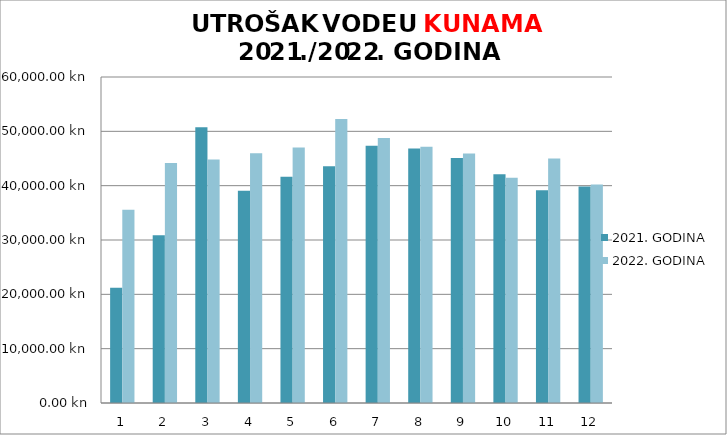
| Category | 2021. GODINA | 2022. GODINA |
|---|---|---|
| 0 | 21202 | 35562.43 |
| 1 | 30879.58 | 44162.57 |
| 2 | 50768.82 | 44831.15 |
| 3 | 39068.71 | 45962.6 |
| 4 | 41650.66 | 47010.23 |
| 5 | 43554.25 | 52248.86 |
| 6 | 47339.18 | 48785.51 |
| 7 | 46817.54 | 47174.18 |
| 8 | 45086.61 | 45898.17 |
| 9 | 42088.32 | 41471.99 |
| 10 | 39147.07 | 44984.91 |
| 11 | 39827.63 | 40200.6 |